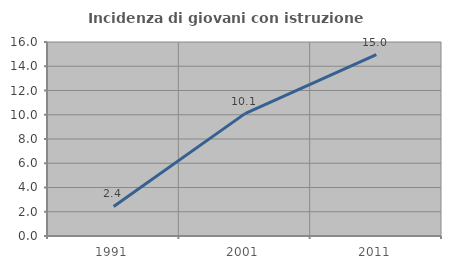
| Category | Incidenza di giovani con istruzione universitaria |
|---|---|
| 1991.0 | 2.439 |
| 2001.0 | 10.092 |
| 2011.0 | 14.953 |